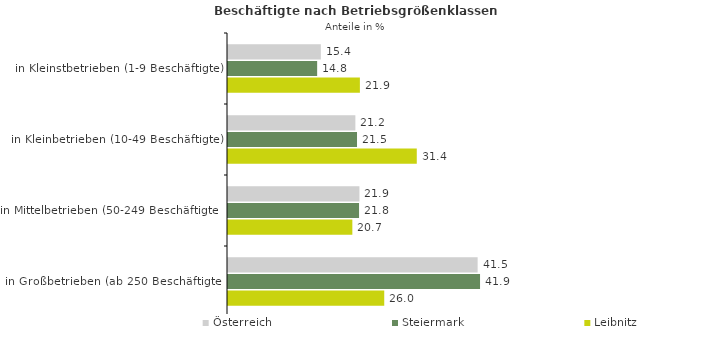
| Category | Österreich | Steiermark | Leibnitz |
|---|---|---|---|
| in Kleinstbetrieben (1-9 Beschäftigte) | 15.439 | 14.827 | 21.935 |
| in Kleinbetrieben (10-49 Beschäftigte) | 21.184 | 21.458 | 31.398 |
| in Mittelbetrieben (50-249 Beschäftigte) | 21.859 | 21.796 | 20.681 |
| in Großbetrieben (ab 250 Beschäftigte) | 41.518 | 41.919 | 25.986 |